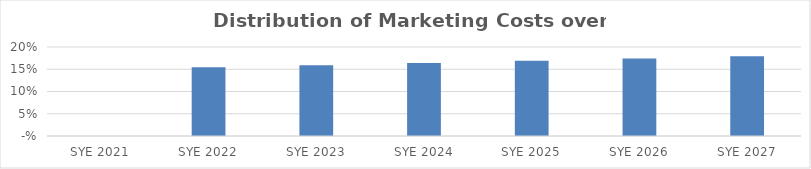
| Category | Series 0 |
|---|---|
| 2021.0 | 0 |
| 2022.0 | 0.155 |
| 2023.0 | 0.159 |
| 2024.0 | 0.164 |
| 2025.0 | 0.169 |
| 2026.0 | 0.174 |
| 2027.0 | 0.179 |